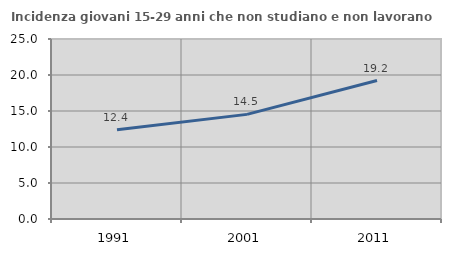
| Category | Incidenza giovani 15-29 anni che non studiano e non lavorano  |
|---|---|
| 1991.0 | 12.396 |
| 2001.0 | 14.53 |
| 2011.0 | 19.231 |